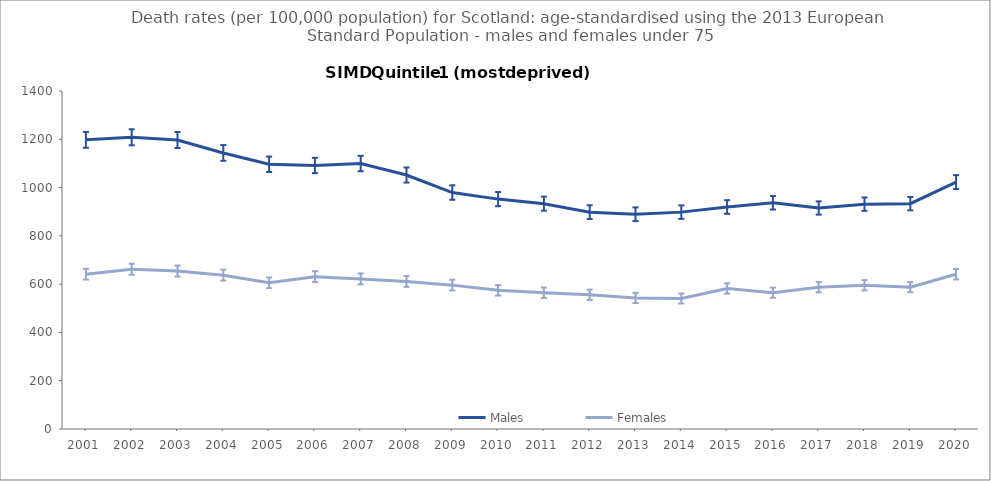
| Category | Males | Females |
|---|---|---|
| 2001.0 | 1197.6 | 641.2 |
| 2002.0 | 1208.3 | 661.5 |
| 2003.0 | 1197 | 654.3 |
| 2004.0 | 1143.5 | 637.2 |
| 2005.0 | 1096.5 | 605.5 |
| 2006.0 | 1091.4 | 631 |
| 2007.0 | 1099.7 | 621.5 |
| 2008.0 | 1052 | 611.1 |
| 2009.0 | 979.4 | 595.9 |
| 2010.0 | 952.2 | 574.3 |
| 2011.0 | 933.4 | 564.5 |
| 2012.0 | 898.2 | 555.8 |
| 2013.0 | 889.6 | 542.8 |
| 2014.0 | 898.3 | 540.5 |
| 2015.0 | 919.6 | 582.1 |
| 2016.0 | 937.1 | 564.7 |
| 2017.0 | 915.4 | 587.3 |
| 2018.0 | 931.3 | 595.4 |
| 2019.0 | 933.4 | 587.6 |
| 2020.0 | 1022.8 | 641.2 |